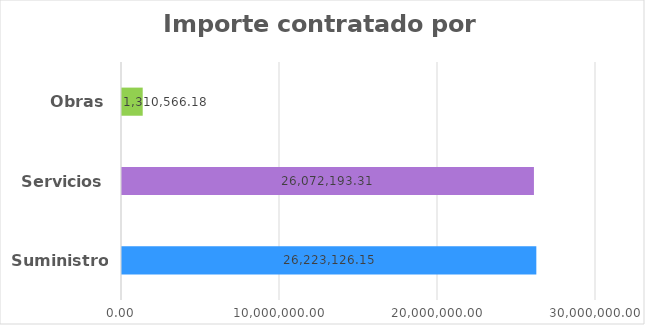
| Category | Series 0 |
|---|---|
| Suministros | 26223126.15 |
| Servicios | 26072193.311 |
| Obras | 1310566.18 |